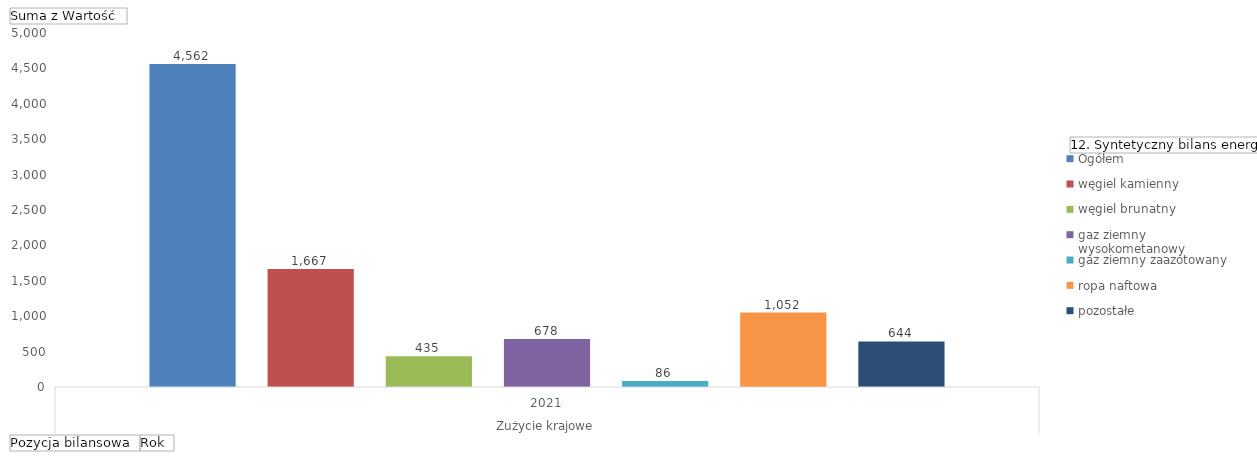
| Category | Ogółem | węgiel kamienny | węgiel brunatny | gaz ziemny wysokometanowy | gaz ziemny zaazotowany | ropa naftowa | pozostałe |
|---|---|---|---|---|---|---|---|
| 0 | 4562 | 1667 | 435 | 678 | 86 | 1052 | 644 |